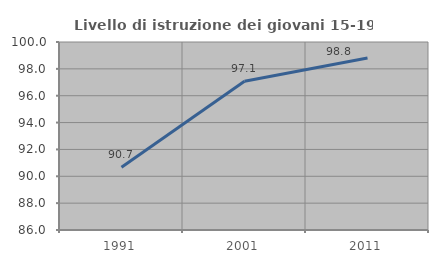
| Category | Livello di istruzione dei giovani 15-19 anni |
|---|---|
| 1991.0 | 90.679 |
| 2001.0 | 97.077 |
| 2011.0 | 98.801 |